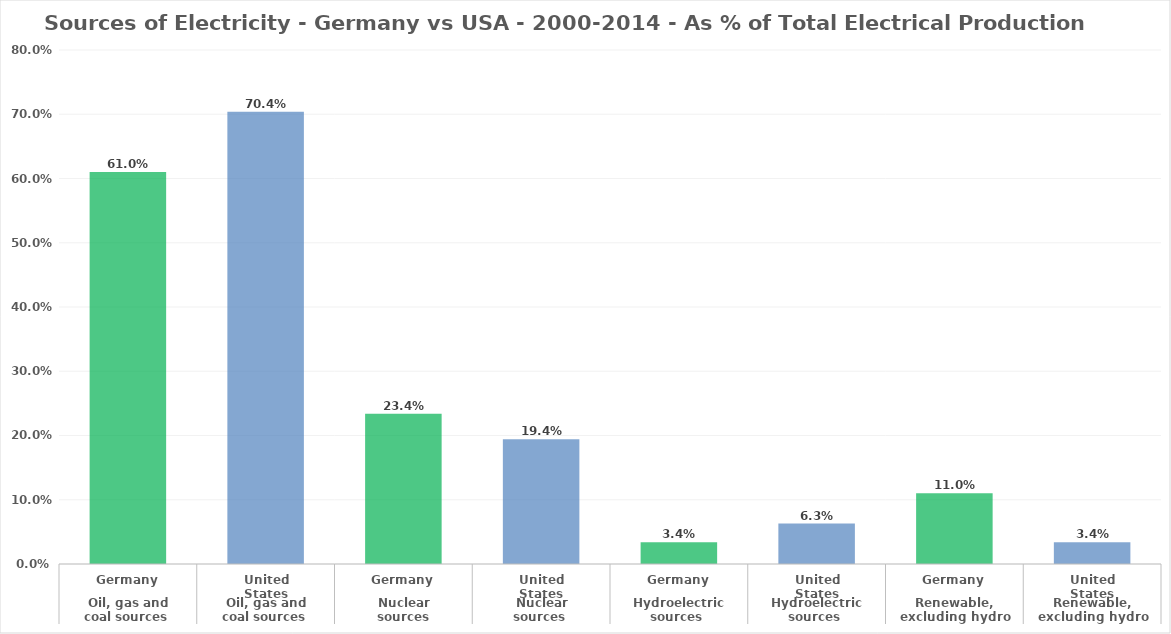
| Category | Average 2000-2014 |
|---|---|
| 0 | 0.61 |
| 1 | 0.704 |
| 2 | 0.234 |
| 3 | 0.194 |
| 4 | 0.034 |
| 5 | 0.063 |
| 6 | 0.11 |
| 7 | 0.034 |